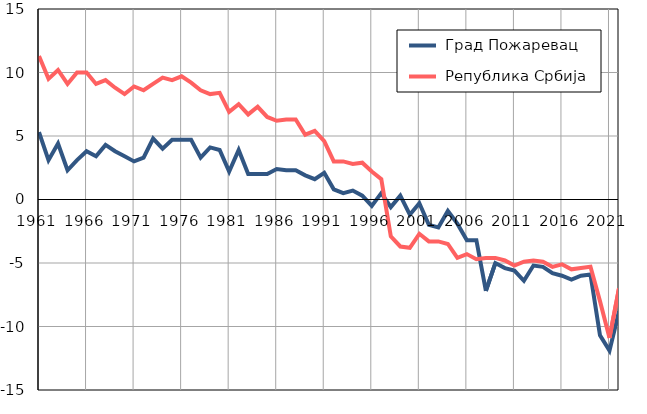
| Category |  Град Пожаревац |  Република Србија |
|---|---|---|
| 1961.0 | 5.3 | 11.3 |
| 1962.0 | 3.1 | 9.5 |
| 1963.0 | 4.4 | 10.2 |
| 1964.0 | 2.3 | 9.1 |
| 1965.0 | 3.1 | 10 |
| 1966.0 | 3.8 | 10 |
| 1967.0 | 3.4 | 9.1 |
| 1968.0 | 4.3 | 9.4 |
| 1969.0 | 3.8 | 8.8 |
| 1970.0 | 3.4 | 8.3 |
| 1971.0 | 3 | 8.9 |
| 1972.0 | 3.3 | 8.6 |
| 1973.0 | 4.8 | 9.1 |
| 1974.0 | 4 | 9.6 |
| 1975.0 | 4.7 | 9.4 |
| 1976.0 | 4.7 | 9.7 |
| 1977.0 | 4.7 | 9.2 |
| 1978.0 | 3.3 | 8.6 |
| 1979.0 | 4.1 | 8.3 |
| 1980.0 | 3.9 | 8.4 |
| 1981.0 | 2.2 | 6.9 |
| 1982.0 | 3.9 | 7.5 |
| 1983.0 | 2 | 6.7 |
| 1984.0 | 2 | 7.3 |
| 1985.0 | 2 | 6.5 |
| 1986.0 | 2.4 | 6.2 |
| 1987.0 | 2.3 | 6.3 |
| 1988.0 | 2.3 | 6.3 |
| 1989.0 | 1.9 | 5.1 |
| 1990.0 | 1.6 | 5.4 |
| 1991.0 | 2.1 | 4.6 |
| 1992.0 | 0.8 | 3 |
| 1993.0 | 0.5 | 3 |
| 1994.0 | 0.7 | 2.8 |
| 1995.0 | 0.3 | 2.9 |
| 1996.0 | -0.5 | 2.2 |
| 1997.0 | 0.5 | 1.6 |
| 1998.0 | -0.6 | -2.9 |
| 1999.0 | 0.3 | -3.7 |
| 2000.0 | -1.2 | -3.8 |
| 2001.0 | -0.3 | -2.7 |
| 2002.0 | -2 | -3.3 |
| 2003.0 | -2.2 | -3.3 |
| 2004.0 | -0.9 | -3.5 |
| 2005.0 | -1.9 | -4.6 |
| 2006.0 | -3.2 | -4.3 |
| 2007.0 | -3.2 | -4.7 |
| 2008.0 | -7.2 | -4.6 |
| 2009.0 | -5 | -4.6 |
| 2010.0 | -5.4 | -4.8 |
| 2011.0 | -5.6 | -5.2 |
| 2012.0 | -6.4 | -4.9 |
| 2013.0 | -5.2 | -4.8 |
| 2014.0 | -5.3 | -4.9 |
| 2015.0 | -5.8 | -5.3 |
| 2016.0 | -6 | -5.1 |
| 2017.0 | -6.3 | -5.5 |
| 2018.0 | -6 | -5.4 |
| 2019.0 | -5.9 | -5.3 |
| 2020.0 | -10.7 | -8 |
| 2021.0 | -11.9 | -10.9 |
| 2022.0 | -8.8 | -7 |